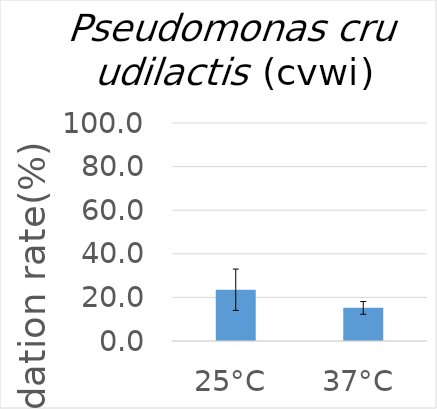
| Category | Series 0 |
|---|---|
| 25°C | 23.5 |
| 37°C | 15.2 |